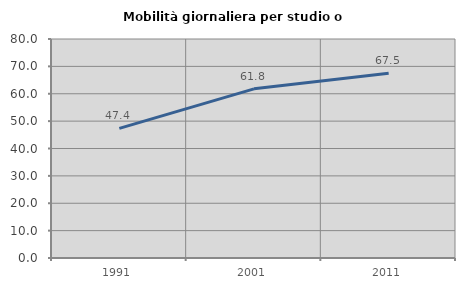
| Category | Mobilità giornaliera per studio o lavoro |
|---|---|
| 1991.0 | 47.368 |
| 2001.0 | 61.8 |
| 2011.0 | 67.489 |